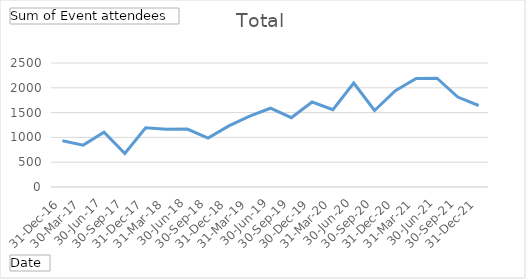
| Category | Total |
|---|---|
| 31-Dec-16 | 931 |
| 30-Mar-17 | 844 |
| 30-Jun-17 | 1104 |
| 30-Sep-17 | 676 |
| 31-Dec-17 | 1195 |
| 31-Mar-18 | 1165 |
| 30-Jun-18 | 1169 |
| 30-Sep-18 | 986 |
| 31-Dec-18 | 1232 |
| 31-Mar-19 | 1427 |
| 30-Jun-19 | 1588 |
| 30-Sep-19 | 1398 |
| 30-Dec-19 | 1713 |
| 31-Mar-20 | 1559 |
| 30-Jun-20 | 2097 |
| 30-Sep-20 | 1543 |
| 31-Dec-20 | 1943 |
| 31-Mar-21 | 2186 |
| 30-Jun-21 | 2194 |
| 30-Sep-21 | 1813 |
| 31-Dec-21 | 1643 |